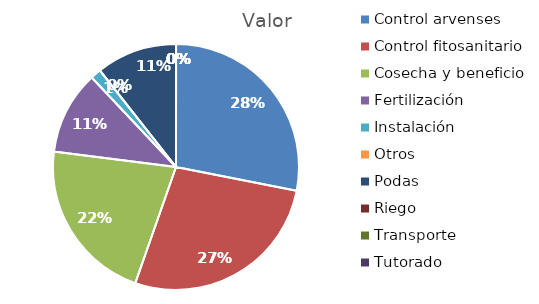
| Category | Valor |
|---|---|
| Control arvenses | 25728000 |
| Control fitosanitario | 24960000 |
| Cosecha y beneficio | 19807085.714 |
| Fertilización | 10048000 |
| Instalación | 1280000 |
| Otros | 0 |
| Podas | 9728000 |
| Riego | 0 |
| Transporte | 0 |
| Tutorado | 0 |